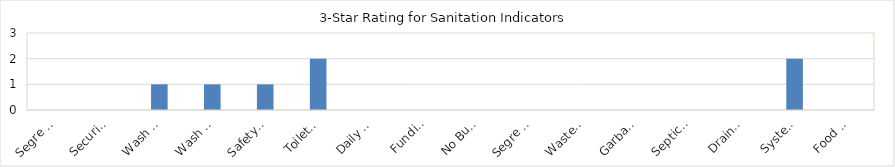
| Category | Series 0 |
|---|---|
| Segre gated Toilets  | 0 |
| Security of Toilets | 0 |
| Wash Facility for Toilets | 1 |
| Wash Facility for MHM | 1 |
| Safety of Detached Toilets | 1 |
| Toilets for Disabled | 2 |
| Daily Cleaning of Toilets | 0 |
| Funding for Repairs | 0 |
| No Burning of Waste | 0 |
| Segre gated Bins | 0 |
| Waste Segre gation | 0 |
| Garbage Collection | 0 |
| Septic Tank | 0 |
| Drainage | 0 |
| System for Flood | 2 |
| Food Handlers | 0 |